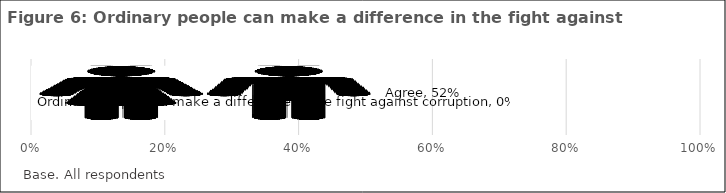
| Category | Ordinary people can make a difference in the fight against corruption | Agree |
|---|---|---|
| 0 |  | 0.52 |